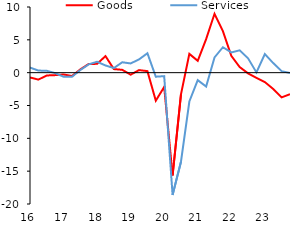
| Category | Goods | Services |
|---|---|---|
| 2016-03-01 | -0.731 | 0.779 |
| 2016-06-01 | -1.057 | 0.32 |
| 2016-09-01 | -0.428 | 0.287 |
| 2016-12-01 | -0.373 | -0.075 |
| 2017-03-01 | -0.273 | -0.615 |
| 2017-06-01 | -0.513 | -0.635 |
| 2017-09-01 | 0.499 | 0.401 |
| 2017-12-01 | 1.325 | 1.266 |
| 2018-03-01 | 1.343 | 1.661 |
| 2018-06-01 | 2.519 | 1.097 |
| 2018-09-01 | 0.546 | 0.699 |
| 2018-12-01 | 0.433 | 1.586 |
| 2019-03-01 | -0.305 | 1.406 |
| 2019-06-01 | 0.39 | 2.021 |
| 2019-09-01 | 0.234 | 2.957 |
| 2019-12-01 | -4.267 | -0.616 |
| 2020-03-01 | -2.175 | -0.531 |
| 2020-06-01 | -15.659 | -18.619 |
| 2020-09-01 | -3.294 | -13.567 |
| 2020-12-01 | 2.857 | -4.391 |
| 2021-03-01 | 1.816 | -1.147 |
| 2021-06-01 | 5.1 | -2.101 |
| 2021-09-01 | 8.964 | 2.313 |
| 2021-12-01 | 6.331 | 3.876 |
| 2022-03-01 | 2.561 | 3.076 |
| 2022-06-01 | 0.861 | 3.391 |
| 2022-09-01 | -0.107 | 2.18 |
| 2022-12-01 | -0.777 | 0.034 |
| 2023-03-01 | -1.422 | 2.824 |
| 2023-06-01 | -2.497 | 1.463 |
| 2023-09-01 | -3.764 | 0.225 |
| 2023-12-01 | -3.294 | -0.044 |